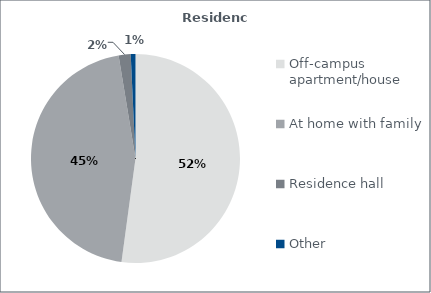
| Category | Series 0 |
|---|---|
| Off-campus apartment/house | 0.521 |
| At home with family  | 0.453 |
| Residence hall | 0.019 |
| Other | 0.007 |